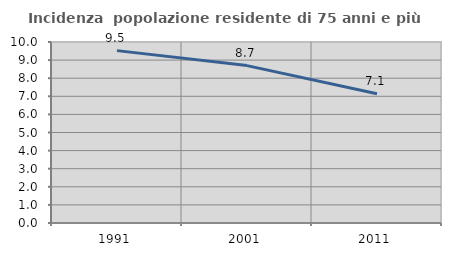
| Category | Incidenza  popolazione residente di 75 anni e più |
|---|---|
| 1991.0 | 9.524 |
| 2001.0 | 8.696 |
| 2011.0 | 7.143 |